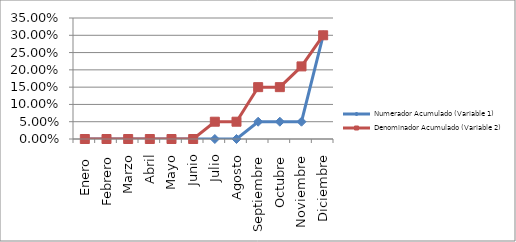
| Category | Numerador Acumulado (Variable 1) | Denominador Acumulado (Variable 2) |
|---|---|---|
| Enero  | 0 | 0 |
| Febrero | 0 | 0 |
| Marzo | 0 | 0 |
| Abril | 0 | 0 |
| Mayo | 0 | 0 |
| Junio | 0 | 0 |
| Julio | 0 | 0.05 |
| Agosto | 0 | 0.05 |
| Septiembre | 0.05 | 0.15 |
| Octubre | 0.05 | 0.15 |
| Noviembre | 0.05 | 0.21 |
| Diciembre | 0.3 | 0.3 |